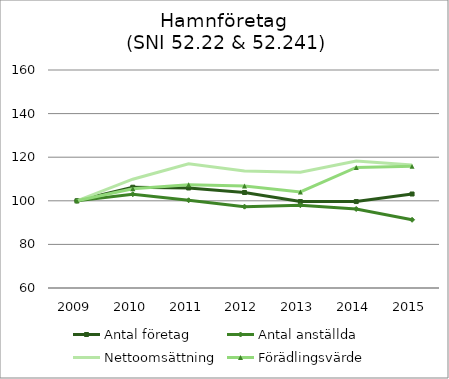
| Category | Antal företag | Antal anställda | Nettoomsättning | Förädlingsvärde |
|---|---|---|---|---|
| 2009.0 | 100 | 100 | 100 | 100 |
| 2010.0 | 106.228 | 103.02 | 109.902 | 105.559 |
| 2011.0 | 105.882 | 100.236 | 116.936 | 107.342 |
| 2012.0 | 103.806 | 97.308 | 113.725 | 106.839 |
| 2013.0 | 99.654 | 97.963 | 113.076 | 104.07 |
| 2014.0 | 99.654 | 96.253 | 118.297 | 115.293 |
| 2015.0 | 103.114 | 91.286 | 116.394 | 115.836 |